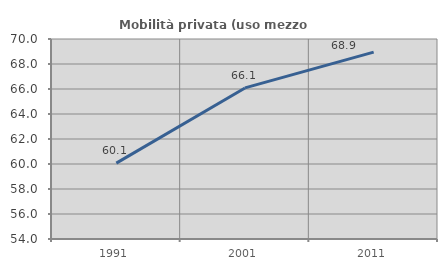
| Category | Mobilità privata (uso mezzo privato) |
|---|---|
| 1991.0 | 60.068 |
| 2001.0 | 66.086 |
| 2011.0 | 68.949 |